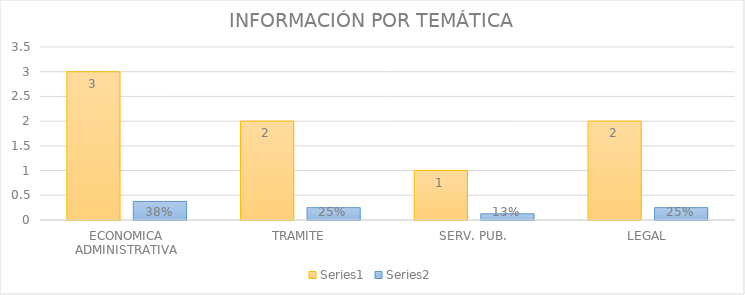
| Category | Series 3 | Series 4 |
|---|---|---|
| ECONOMICA ADMINISTRATIVA | 3 | 0.375 |
| TRAMITE | 2 | 0.25 |
| SERV. PUB. | 1 | 0.125 |
| LEGAL | 2 | 0.25 |